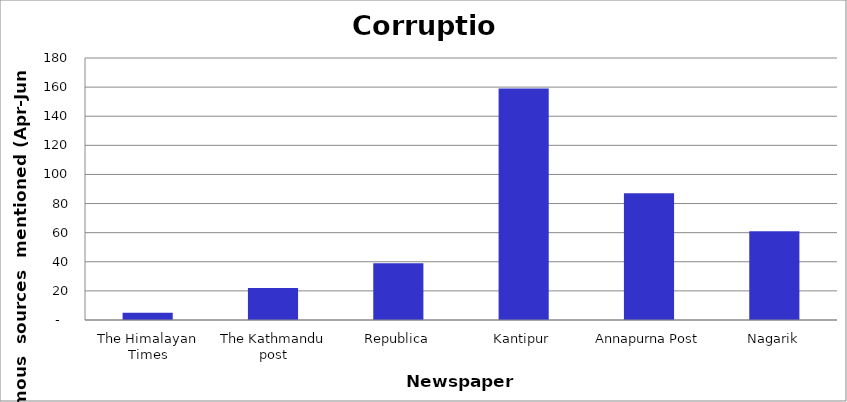
| Category | Corruption |
|---|---|
| The Himalayan Times | 5 |
| The Kathmandu post | 22 |
| Republica | 39 |
| Kantipur | 159 |
| Annapurna Post | 87 |
| Nagarik | 61 |